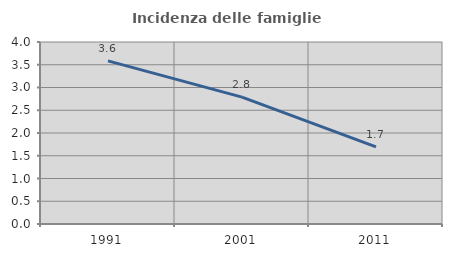
| Category | Incidenza delle famiglie numerose |
|---|---|
| 1991.0 | 3.586 |
| 2001.0 | 2.789 |
| 2011.0 | 1.695 |